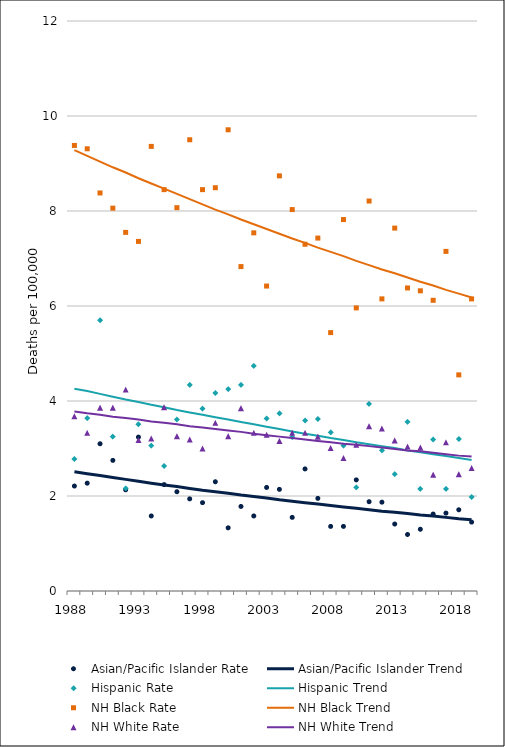
| Category | Asian/Pacific Islander Rate | Asian/Pacific Islander Trend | Hispanic Rate | Hispanic Trend | NH Black Rate | NH Black Trend | NH White Rate | NH White Trend |
|---|---|---|---|---|---|---|---|---|
| 1988.0 | 2.21 | 2.51 | 2.78 | 4.26 | 9.38 | 9.28 | 3.68 | 3.78 |
| 1989.0 | 2.27 | 2.47 | 3.64 | 4.21 | 9.31 | 9.16 | 3.33 | 3.74 |
| 1990.0 | 3.1 | 2.43 | 5.7 | 4.15 | 8.38 | 9.04 | 3.86 | 3.71 |
| 1991.0 | 2.75 | 2.39 | 3.25 | 4.09 | 8.06 | 8.92 | 3.86 | 3.67 |
| 1992.0 | 2.13 | 2.35 | 2.16 | 4.03 | 7.55 | 8.81 | 4.24 | 3.64 |
| 1993.0 | 3.24 | 2.31 | 3.51 | 3.98 | 7.36 | 8.69 | 3.18 | 3.61 |
| 1994.0 | 1.58 | 2.27 | 3.06 | 3.92 | 9.36 | 8.58 | 3.21 | 3.57 |
| 1995.0 | 2.24 | 2.23 | 2.63 | 3.87 | 8.45 | 8.47 | 3.87 | 3.54 |
| 1996.0 | 2.09 | 2.2 | 3.61 | 3.81 | 8.07 | 8.36 | 3.26 | 3.51 |
| 1997.0 | 1.94 | 2.16 | 4.34 | 3.76 | 9.5 | 8.25 | 3.19 | 3.47 |
| 1998.0 | 1.86 | 2.12 | 3.84 | 3.71 | 8.45 | 8.14 | 3 | 3.44 |
| 1999.0 | 2.3 | 2.09 | 4.17 | 3.66 | 8.49 | 8.03 | 3.54 | 3.41 |
| 2000.0 | 1.33 | 2.06 | 4.25 | 3.61 | 9.71 | 7.93 | 3.26 | 3.38 |
| 2001.0 | 1.78 | 2.02 | 4.34 | 3.56 | 6.83 | 7.82 | 3.85 | 3.35 |
| 2002.0 | 1.58 | 1.99 | 4.74 | 3.51 | 7.54 | 7.72 | 3.33 | 3.31 |
| 2003.0 | 2.18 | 1.96 | 3.63 | 3.46 | 6.42 | 7.62 | 3.29 | 3.28 |
| 2004.0 | 2.14 | 1.92 | 3.74 | 3.41 | 8.74 | 7.52 | 3.16 | 3.25 |
| 2005.0 | 1.55 | 1.89 | 3.24 | 3.36 | 8.03 | 7.42 | 3.33 | 3.22 |
| 2006.0 | 2.57 | 1.86 | 3.59 | 3.31 | 7.3 | 7.33 | 3.33 | 3.19 |
| 2007.0 | 1.95 | 1.83 | 3.62 | 3.27 | 7.43 | 7.23 | 3.25 | 3.16 |
| 2008.0 | 1.36 | 1.8 | 3.34 | 3.22 | 5.44 | 7.14 | 3.01 | 3.13 |
| 2009.0 | 1.36 | 1.77 | 3.06 | 3.18 | 7.82 | 7.05 | 2.8 | 3.1 |
| 2010.0 | 2.34 | 1.74 | 2.18 | 3.13 | 5.96 | 6.95 | 3.08 | 3.08 |
| 2011.0 | 1.88 | 1.71 | 3.94 | 3.09 | 8.21 | 6.86 | 3.47 | 3.05 |
| 2012.0 | 1.87 | 1.68 | 2.96 | 3.05 | 6.15 | 6.77 | 3.42 | 3.02 |
| 2013.0 | 1.41 | 1.66 | 2.46 | 3.01 | 7.64 | 6.69 | 3.17 | 2.99 |
| 2014.0 | 1.19 | 1.63 | 3.56 | 2.96 | 6.38 | 6.6 | 3.04 | 2.96 |
| 2015.0 | 1.3 | 1.6 | 2.15 | 2.92 | 6.32 | 6.51 | 3.02 | 2.94 |
| 2016.0 | 1.62 | 1.58 | 3.19 | 2.88 | 6.12 | 6.43 | 2.45 | 2.91 |
| 2017.0 | 1.64 | 1.55 | 2.15 | 2.84 | 7.15 | 6.34 | 3.13 | 2.88 |
| 2018.0 | 1.71 | 1.52 | 3.2 | 2.8 | 4.55 | 6.26 | 2.46 | 2.85 |
| 2019.0 | 1.45 | 1.5 | 1.98 | 2.76 | 6.15 | 6.18 | 2.59 | 2.83 |